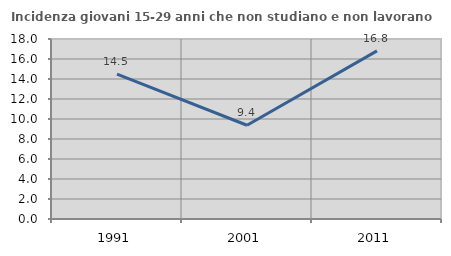
| Category | Incidenza giovani 15-29 anni che non studiano e non lavorano  |
|---|---|
| 1991.0 | 14.493 |
| 2001.0 | 9.375 |
| 2011.0 | 16.812 |